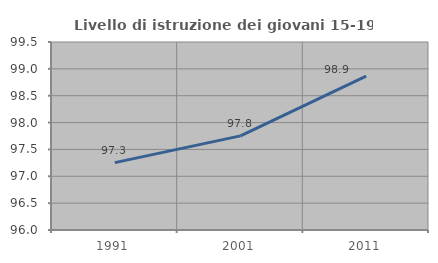
| Category | Livello di istruzione dei giovani 15-19 anni |
|---|---|
| 1991.0 | 97.254 |
| 2001.0 | 97.753 |
| 2011.0 | 98.864 |